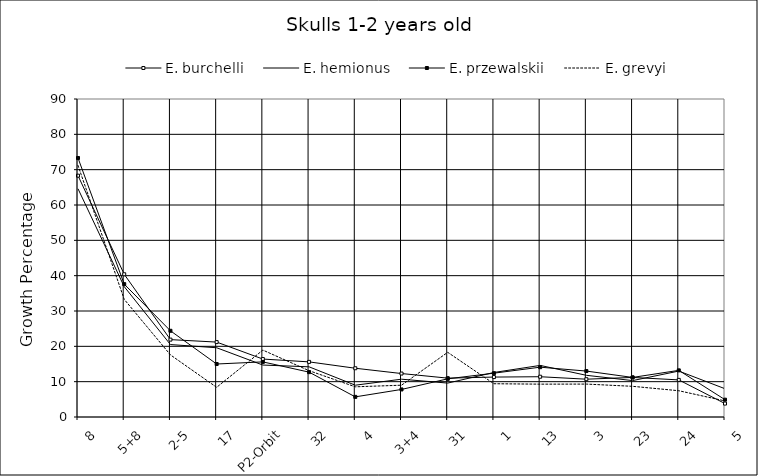
| Category | E. burchelli | E. hemionus | E. przewalskii | E. grevyi |
|---|---|---|---|---|
| 8 | 68.3 | 64.6 | 73.3 | 71.2 |
| 5+8 | 40.4 | 36.9 | 37.6 | 33.3 |
| 2-5 | 21.9 | 20.5 | 24.4 | 17.582 |
| 17 | 21.2 | 19.6 | 15 | 8.4 |
| P2-Orbit | 16.4 | 14.7 | 15.6 | 18.933 |
| 32 | 15.6 | 14.2 | 12.7 | 13.108 |
| 4 | 13.8 | 9 | 5.7 | 8.545 |
| 3+4 | 12.3 | 10.7 | 7.8 | 9 |
| 31 | 11 | 9.6 | 10.8 | 18.307 |
| 1 | 11.3 | 12.6 | 12.4 | 9.414 |
| 13 | 11.4 | 14.6 | 14.1 | 9.295 |
| 3 | 10.7 | 11.8 | 13 | 9.316 |
| 23 | 11.2 | 10.3 | 11.2 | 8.684 |
| 24 | 10.5 | 13 | 13.2 | 7.435 |
| 5 | 3.8 | 8 | 4.9 | 4.552 |